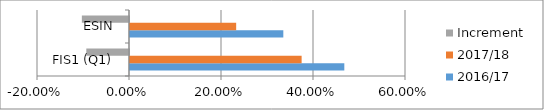
| Category | 2016/17 | 2017/18 | Increment |
|---|---|---|---|
| FIS1 (Q1) | 0.466 | 0.373 | -0.093 |
| ESIN | 0.333 | 0.231 | -0.102 |